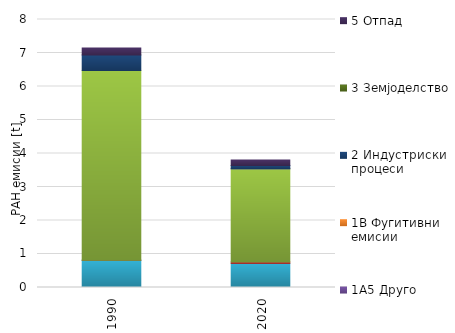
| Category | 1A1 | 1A2 | 1A3 | 1A4 | 1A5 | 1B | 2 | 3 | 5 |
|---|---|---|---|---|---|---|---|---|---|
| 1990 | 0.004 | 0.809 | 0.001 | 5.662 | 0 | 0 | 0.464 | 0 | 0.211 |
| 2020 | 0.002 | 0.717 | 0.04 | 2.787 | 0 | 0 | 0.096 | 0 | 0.163 |